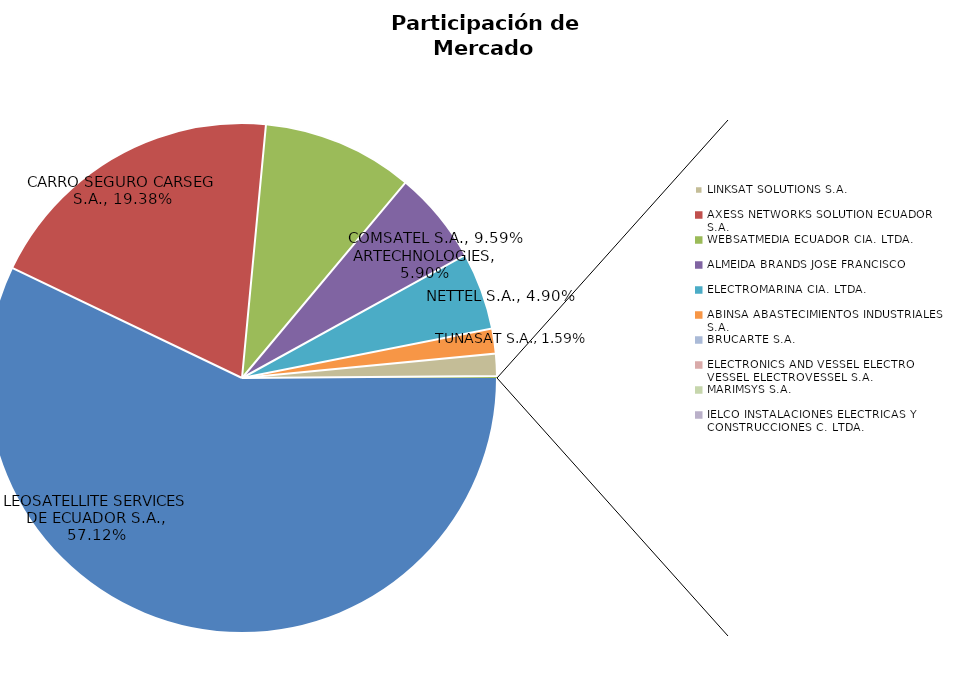
| Category | Series 0 |
|---|---|
| LEOSATELLITE SERVICES DE ECUADOR S.A. | 0.571 |
| CARRO SEGURO CARSEG S.A. | 0.194 |
| COMSATEL S.A. | 0.096 |
| ARTECHNOLOGIES | 0.059 |
| NETTEL S.A. | 0.049 |
| TUNASAT S.A. | 0.016 |
| LINKSAT SOLUTIONS S.A. | 0.014 |
| AXESS NETWORKS SOLUTION ECUADOR S.A. | 0.001 |
| WEBSATMEDIA ECUADOR CIA. LTDA. | 0.001 |
| ALMEIDA BRANDS JOSE FRANCISCO | 0 |
| ELECTROMARINA CIA. LTDA. | 0 |
| ABINSA ABASTECIMIENTOS INDUSTRIALES S.A. | 0 |
| BRUCARTE S.A. | 0 |
| ELECTRONICS AND VESSEL ELECTRO VESSEL ELECTROVESSEL S.A. | 0 |
| MARIMSYS S.A. | 0 |
| IELCO INSTALACIONES ELECTRICAS Y CONSTRUCCIONES C. LTDA. | 0 |